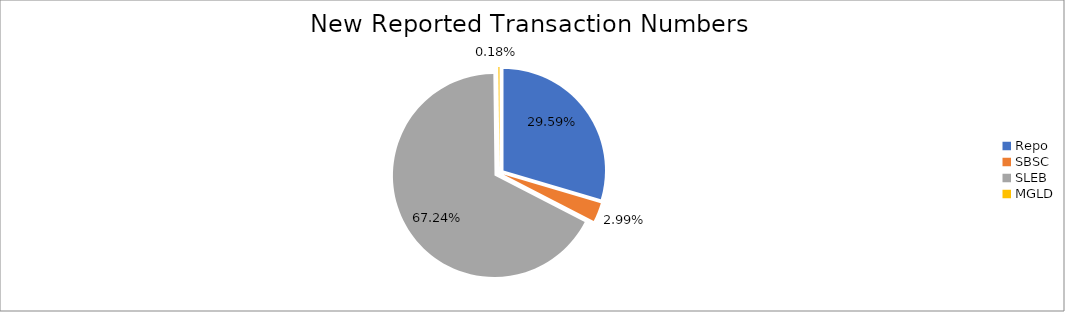
| Category | Series 0 |
|---|---|
| Repo | 412492 |
| SBSC | 41720 |
| SLEB | 937412 |
| MGLD | 2541 |